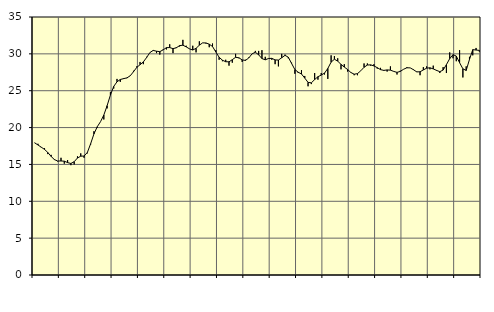
| Category | Piggar | Series 1 |
|---|---|---|
| nan | 17.9 | 17.93 |
| 87.0 | 17.8 | 17.64 |
| 87.0 | 17.3 | 17.34 |
| 87.0 | 17.2 | 17.04 |
| nan | 16.4 | 16.62 |
| 88.0 | 16.3 | 16.08 |
| 88.0 | 15.6 | 15.66 |
| 88.0 | 15.4 | 15.46 |
| nan | 15.9 | 15.47 |
| 89.0 | 15.1 | 15.44 |
| 89.0 | 15.6 | 15.25 |
| 89.0 | 14.9 | 15.13 |
| nan | 15 | 15.37 |
| 90.0 | 16.1 | 15.87 |
| 90.0 | 16.5 | 16.12 |
| 90.0 | 15.9 | 16.14 |
| nan | 16.5 | 16.62 |
| 91.0 | 17.7 | 17.81 |
| 91.0 | 19.5 | 19.14 |
| 91.0 | 20 | 20.11 |
| nan | 20.8 | 20.8 |
| 92.0 | 21.1 | 21.7 |
| 92.0 | 22.6 | 22.97 |
| 92.0 | 24.8 | 24.41 |
| nan | 25.3 | 25.58 |
| 93.0 | 26.6 | 26.21 |
| 93.0 | 26.2 | 26.52 |
| 93.0 | 26.7 | 26.64 |
| nan | 26.7 | 26.74 |
| 94.0 | 27 | 27.02 |
| 94.0 | 27.7 | 27.57 |
| 94.0 | 28.3 | 28.16 |
| nan | 28.9 | 28.53 |
| 95.0 | 28.6 | 28.91 |
| 95.0 | 29.6 | 29.51 |
| 95.0 | 30.2 | 30.18 |
| nan | 30.4 | 30.47 |
| 96.0 | 30.1 | 30.36 |
| 96.0 | 29.9 | 30.3 |
| 96.0 | 30.6 | 30.54 |
| nan | 30.6 | 30.84 |
| 97.0 | 31.3 | 30.85 |
| 97.0 | 30.1 | 30.71 |
| 97.0 | 30.9 | 30.82 |
| nan | 31 | 31.12 |
| 98.0 | 31.9 | 31.17 |
| 98.0 | 31.1 | 30.95 |
| 98.0 | 30.7 | 30.68 |
| nan | 31.1 | 30.52 |
| 99.0 | 30.2 | 30.75 |
| 99.0 | 31.7 | 31.18 |
| 99.0 | 31.5 | 31.49 |
| nan | 31.4 | 31.48 |
| 0.0 | 30.9 | 31.31 |
| 0.0 | 31.4 | 31 |
| 0.0 | 30.5 | 30.25 |
| nan | 29.2 | 29.54 |
| 1.0 | 29 | 29.14 |
| 1.0 | 29.2 | 28.93 |
| 1.0 | 28.4 | 28.92 |
| nan | 28.8 | 29.21 |
| 2.0 | 30 | 29.53 |
| 2.0 | 29.4 | 29.47 |
| 2.0 | 28.9 | 29.18 |
| nan | 29.2 | 29.11 |
| 3.0 | 29.5 | 29.44 |
| 3.0 | 30 | 30 |
| 3.0 | 30.4 | 30.22 |
| nan | 30.4 | 29.87 |
| 4.0 | 30.5 | 29.36 |
| 4.0 | 29.6 | 29.19 |
| 4.0 | 29.4 | 29.37 |
| nan | 29.2 | 29.39 |
| 5.0 | 28.6 | 29.18 |
| 5.0 | 28.3 | 29.16 |
| 5.0 | 30 | 29.47 |
| nan | 29.9 | 29.8 |
| 6.0 | 29.4 | 29.55 |
| 6.0 | 28.8 | 28.7 |
| 6.0 | 27.3 | 27.87 |
| nan | 27.4 | 27.51 |
| 7.0 | 27.8 | 27.27 |
| 7.0 | 27 | 26.71 |
| 7.0 | 25.6 | 26.13 |
| nan | 25.9 | 26.07 |
| 8.0 | 27.4 | 26.51 |
| 8.0 | 26.5 | 26.9 |
| 8.0 | 27.4 | 27.12 |
| nan | 27.2 | 27.39 |
| 9.0 | 26.6 | 28.02 |
| 9.0 | 29.8 | 28.88 |
| 9.0 | 29.7 | 29.27 |
| nan | 29.4 | 29.01 |
| 10.0 | 27.9 | 28.57 |
| 10.0 | 28.6 | 28.21 |
| 10.0 | 27.6 | 27.88 |
| nan | 27.5 | 27.47 |
| 11.0 | 27.1 | 27.24 |
| 11.0 | 27.1 | 27.32 |
| 11.0 | 27.7 | 27.7 |
| nan | 28.7 | 28.18 |
| 12.0 | 28.7 | 28.48 |
| 12.0 | 28.4 | 28.51 |
| 12.0 | 28.6 | 28.36 |
| nan | 28 | 28.13 |
| 13.0 | 28.1 | 27.86 |
| 13.0 | 27.7 | 27.76 |
| 13.0 | 27.6 | 27.82 |
| nan | 28.3 | 27.79 |
| 14.0 | 27.6 | 27.62 |
| 14.0 | 27.2 | 27.49 |
| 14.0 | 27.7 | 27.62 |
| nan | 27.9 | 27.91 |
| 15.0 | 28.2 | 28.11 |
| 15.0 | 28.1 | 28.1 |
| 15.0 | 27.9 | 27.85 |
| nan | 27.6 | 27.55 |
| 16.0 | 27.1 | 27.57 |
| 16.0 | 28.2 | 27.82 |
| 16.0 | 28.3 | 28.06 |
| nan | 27.9 | 28.11 |
| 17.0 | 28.4 | 27.96 |
| 17.0 | 27.7 | 27.76 |
| 17.0 | 27.4 | 27.58 |
| nan | 28.2 | 27.8 |
| 18.0 | 27.4 | 28.54 |
| 18.0 | 30.2 | 29.35 |
| 18.0 | 29.4 | 29.89 |
| nan | 29 | 29.7 |
| 19.0 | 30.5 | 28.8 |
| 19.0 | 26.8 | 27.97 |
| 19.0 | 28.3 | 27.75 |
| nan | 29.6 | 29.24 |
| 20.0 | 29.8 | 30.57 |
| 20.0 | 30.8 | 30.52 |
| 20.0 | 30.3 | 30.47 |